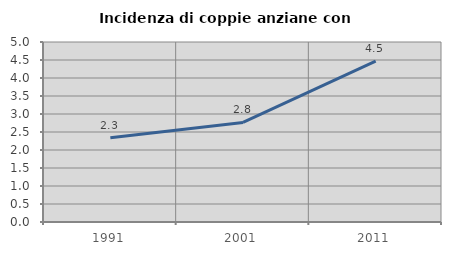
| Category | Incidenza di coppie anziane con figli |
|---|---|
| 1991.0 | 2.34 |
| 2001.0 | 2.765 |
| 2011.0 | 4.468 |